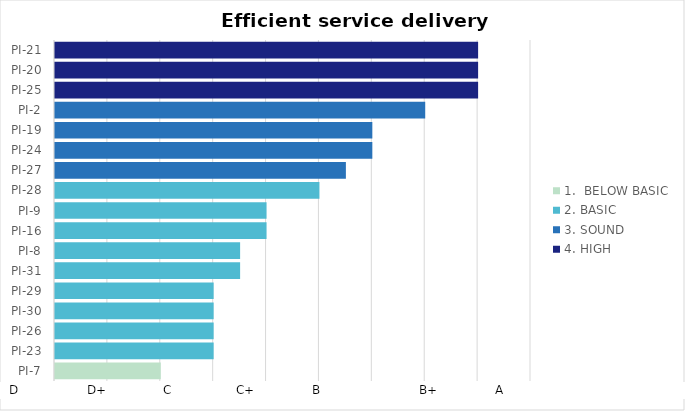
| Category | 4. HIGH | 3. SOUND | 2. BASIC | 1.  BELOW BASIC |
|---|---|---|---|---|
| PI-7 | 0 | 0 | 0 | 1 |
| PI-23 | 0 | 0 | 1.5 | 0 |
| PI-26 | 0 | 0 | 1.5 | 0 |
| PI-30 | 0 | 0 | 1.5 | 0 |
| PI-29 | 0 | 0 | 1.5 | 0 |
| PI-31 | 0 | 0 | 1.75 | 0 |
| PI-8 | 0 | 0 | 1.75 | 0 |
| PI-16 | 0 | 0 | 2 | 0 |
| PI-9 | 0 | 0 | 2 | 0 |
| PI-28 | 0 | 0 | 2.5 | 0 |
| PI-27 | 0 | 2.75 | 0 | 0 |
| PI-24 | 0 | 3 | 0 | 0 |
| PI-19 | 0 | 3 | 0 | 0 |
| PI-2 | 0 | 3.5 | 0 | 0 |
| PI-25 | 4 | 0 | 0 | 0 |
| PI-20 | 4 | 0 | 0 | 0 |
| PI-21 | 4 | 0 | 0 | 0 |